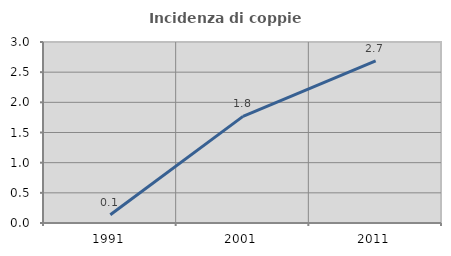
| Category | Incidenza di coppie miste |
|---|---|
| 1991.0 | 0.136 |
| 2001.0 | 1.767 |
| 2011.0 | 2.687 |